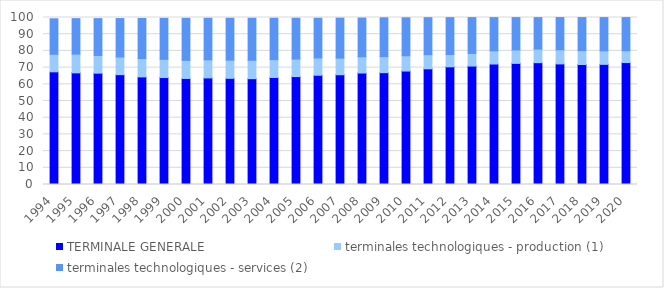
| Category | TERMINALE GENERALE | terminales technologiques - production (1) | terminales technologiques - services (2) |
|---|---|---|---|
| 1994.0 | 67.469 | 10.499 | 21.263 |
| 1995.0 | 66.847 | 11.233 | 21.236 |
| 1996.0 | 66.663 | 10.603 | 22.064 |
| 1997.0 | 65.774 | 10.577 | 23.013 |
| 1998.0 | 64.435 | 11.024 | 23.966 |
| 1999.0 | 64.043 | 10.921 | 24.527 |
| 2000.0 | 63.497 | 10.869 | 25.136 |
| 2001.0 | 63.822 | 10.845 | 24.861 |
| 2002.0 | 63.58 | 10.9 | 25.071 |
| 2003.0 | 63.361 | 11.04 | 25.149 |
| 2004.0 | 64.095 | 10.689 | 24.761 |
| 2005.0 | 64.624 | 10.482 | 24.451 |
| 2006.0 | 65.423 | 10.345 | 23.784 |
| 2007.0 | 65.724 | 9.955 | 23.93 |
| 2008.0 | 66.755 | 9.738 | 23.175 |
| 2009.0 | 66.954 | 9.62 | 23.23 |
| 2010.0 | 67.939 | 9.162 | 22.721 |
| 2011.0 | 69.281 | 8.469 | 22.136 |
| 2012.0 | 70.468 | 7.374 | 22.076 |
| 2013.0 | 70.923 | 7.584 | 21.426 |
| 2014.0 | 72.147 | 7.873 | 19.911 |
| 2015.0 | 72.531 | 8.037 | 19.37 |
| 2016.0 | 72.944 | 8.132 | 18.864 |
| 2017.0 | 72.206 | 8.454 | 19.286 |
| 2018.0 | 71.853 | 8.324 | 19.78 |
| 2019.0 | 71.947 | 8.089 | 19.922 |
| 2020.0 | 73.005 | 7.094 | 19.854 |